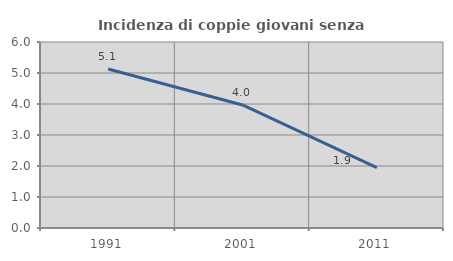
| Category | Incidenza di coppie giovani senza figli |
|---|---|
| 1991.0 | 5.131 |
| 2001.0 | 3.968 |
| 2011.0 | 1.946 |